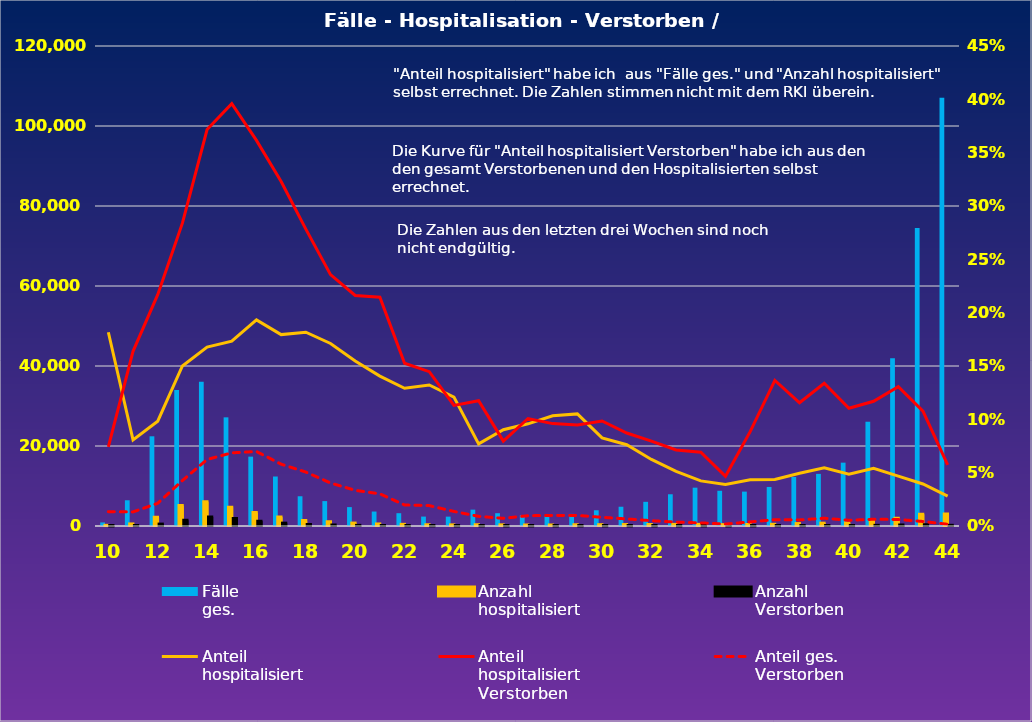
| Category | Fälle
ges. | Anzahl
hospitalisiert | Anzahl
Verstorben |
|---|---|---|---|
| 10.0 | 892 | 162 | 12 |
| 11.0 | 6431 | 519 | 85 |
| 12.0 | 22425 | 2204 | 478 |
| 13.0 | 34016 | 5104 | 1449 |
| 14.0 | 36063 | 6051 | 2249 |
| 15.0 | 27163 | 4705 | 1863 |
| 16.0 | 17337 | 3350 | 1211 |
| 17.0 | 12372 | 2220 | 717 |
| 18.0 | 7435 | 1351 | 376 |
| 19.0 | 6225 | 1065 | 251 |
| 20.0 | 4724 | 731 | 158 |
| 21.0 | 3614 | 508 | 109 |
| 22.0 | 3199 | 413 | 63 |
| 23.0 | 2352 | 311 | 45 |
| 24.0 | 2343 | 283 | 32 |
| 25.0 | 4089 | 315 | 37 |
| 26.0 | 3200 | 289 | 23 |
| 27.0 | 2693 | 258 | 26 |
| 28.0 | 2419 | 250 | 24 |
| 29.0 | 3016 | 317 | 30 |
| 30.0 | 3933 | 325 | 32 |
| 31.0 | 4814 | 367 | 32 |
| 32.0 | 6042 | 377 | 30 |
| 33.0 | 7935 | 407 | 29 |
| 34.0 | 9581 | 405 | 28 |
| 35.0 | 8804 | 343 | 16 |
| 36.0 | 8596 | 373 | 33 |
| 37.0 | 9760 | 425 | 58 |
| 38.0 | 12247 | 606 | 70 |
| 39.0 | 13031 | 710 | 95 |
| 40.0 | 15836 | 770 | 85 |
| 41.0 | 26067 | 1411 | 165 |
| 42.0 | 41937 | 1961 | 256 |
| 43.0 | 74487 | 2935 | 316 |
| 44.0 | 107076 | 2998 | 172 |